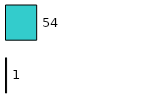
| Category | Series 0 | Series 1 |
|---|---|---|
| 0 | 1 | 54 |